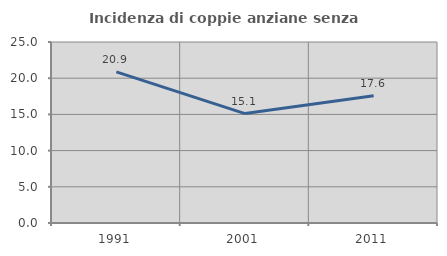
| Category | Incidenza di coppie anziane senza figli  |
|---|---|
| 1991.0 | 20.879 |
| 2001.0 | 15.116 |
| 2011.0 | 17.582 |